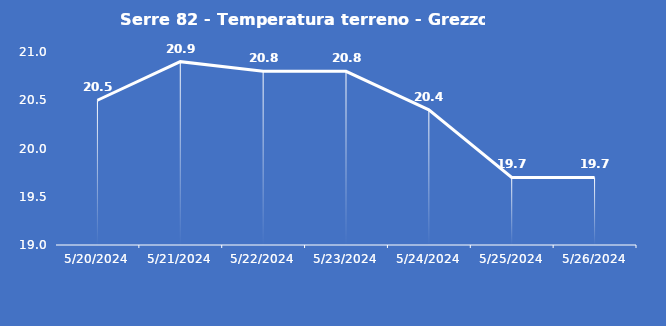
| Category | Serre 82 - Temperatura terreno - Grezzo (°C) |
|---|---|
| 5/20/24 | 20.5 |
| 5/21/24 | 20.9 |
| 5/22/24 | 20.8 |
| 5/23/24 | 20.8 |
| 5/24/24 | 20.4 |
| 5/25/24 | 19.7 |
| 5/26/24 | 19.7 |